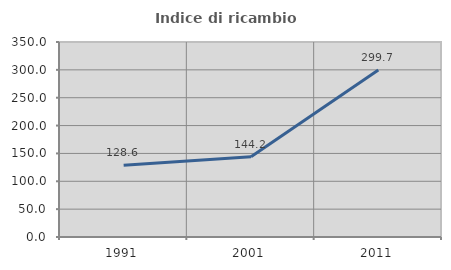
| Category | Indice di ricambio occupazionale  |
|---|---|
| 1991.0 | 128.627 |
| 2001.0 | 144.171 |
| 2011.0 | 299.659 |